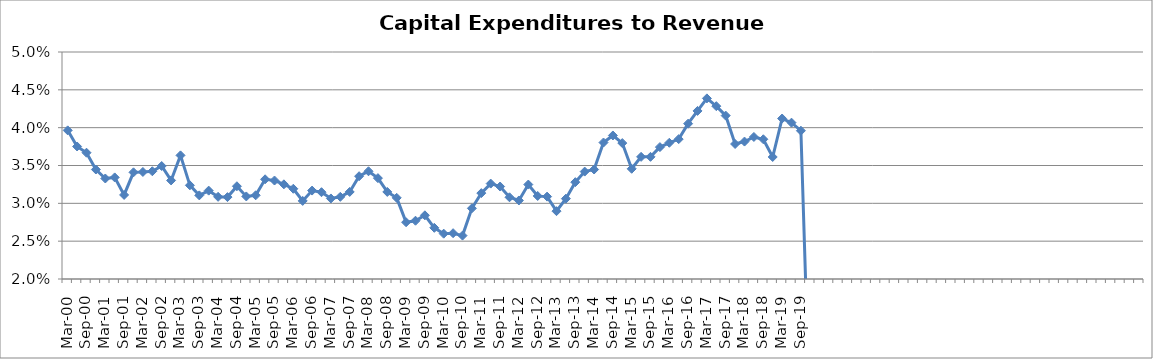
| Category | Series 0 |
|---|---|
| Mar-00 | 0.04 |
| Jun-00 | 0.038 |
| Sep-00 | 0.037 |
| Dec-00 | 0.034 |
| Mar-01 | 0.033 |
| Jun-01 | 0.033 |
| Sep-01 | 0.031 |
| Dec-01 | 0.034 |
| Mar-02 | 0.034 |
| Jun-02 | 0.034 |
| Sep-02 | 0.035 |
| Dec-02 | 0.033 |
| Mar-03 | 0.036 |
| Jun-03 | 0.032 |
| Sep-03 | 0.031 |
| Dec-03 | 0.032 |
| Mar-04 | 0.031 |
| Jun-04 | 0.031 |
| Sep-04 | 0.032 |
| Dec-04 | 0.031 |
| Mar-05 | 0.031 |
| Jun-05 | 0.033 |
| Sep-05 | 0.033 |
| Dec-05 | 0.033 |
| Mar-06 | 0.032 |
| Jun-06 | 0.03 |
| Sep-06 | 0.032 |
| Dec-06 | 0.031 |
| Mar-07 | 0.031 |
| Jun-07 | 0.031 |
| Sep-07 | 0.032 |
| Dec-07 | 0.034 |
| Mar-08 | 0.034 |
| Jun-08 | 0.033 |
| Sep-08 | 0.032 |
| Dec-08 | 0.031 |
| Mar-09 | 0.028 |
| Jun-09 | 0.028 |
| Sep-09 | 0.028 |
| Dec-09 | 0.027 |
| Mar-10 | 0.026 |
| Jun-10 | 0.026 |
| Sep-10 | 0.026 |
| Dec-10 | 0.029 |
| Mar-11 | 0.031 |
| Jun-11 | 0.033 |
| Sep-11 | 0.032 |
| Dec-11 | 0.031 |
| Mar-12 | 0.03 |
| Jun-12 | 0.032 |
| Sep-12 | 0.031 |
| Dec-12 | 0.031 |
| Mar-13 | 0.029 |
| Jun-13 | 0.031 |
| Sep-13 | 0.033 |
| Dec-13 | 0.034 |
| Mar-14 | 0.034 |
| Jun-14 | 0.038 |
| Sep-14 | 0.039 |
| Dec-14 | 0.038 |
| Mar-15 | 0.035 |
| Jun-15 | 0.036 |
| Sep-15 | 0.036 |
| Dec-15 | 0.037 |
| Mar-16 | 0.038 |
| Jun-16 | 0.038 |
| Sep-16 | 0.041 |
| Dec-16 | 0.042 |
| Mar-17 | 0.044 |
| Jun-17 | 0.043 |
| Sep-17 | 0.042 |
| Dec-17 | 0.038 |
| Mar-18 | 0.038 |
| Jun-18 | 0.039 |
| Sep-18 | 0.038 |
| Dec-18 | 0.036 |
| Mar-19 | 0.041 |
| Jun-19 | 0.041 |
| Sep-19 | 0.04 |